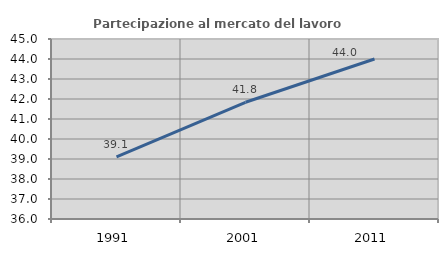
| Category | Partecipazione al mercato del lavoro  femminile |
|---|---|
| 1991.0 | 39.102 |
| 2001.0 | 41.837 |
| 2011.0 | 43.998 |